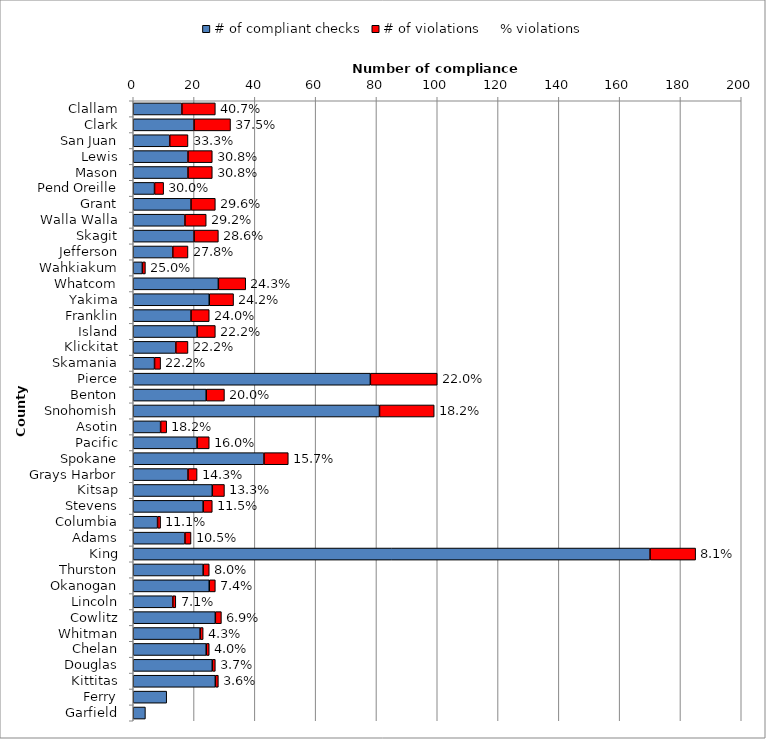
| Category | # of compliant checks | # of violations | % violations |
|---|---|---|---|
| Clallam | 16 | 11 | 0.407 |
| Clark | 20 | 12 | 0.375 |
| San Juan | 12 | 6 | 0.333 |
| Lewis | 18 | 8 | 0.308 |
| Mason | 18 | 8 | 0.308 |
| Pend Oreille | 7 | 3 | 0.3 |
| Grant | 19 | 8 | 0.296 |
| Walla Walla | 17 | 7 | 0.292 |
| Skagit | 20 | 8 | 0.286 |
| Jefferson | 13 | 5 | 0.278 |
| Wahkiakum | 3 | 1 | 0.25 |
| Whatcom | 28 | 9 | 0.243 |
| Yakima | 25 | 8 | 0.242 |
| Franklin | 19 | 6 | 0.24 |
| Island | 21 | 6 | 0.222 |
| Klickitat | 14 | 4 | 0.222 |
| Skamania | 7 | 2 | 0.222 |
| Pierce | 78 | 22 | 0.22 |
| Benton | 24 | 6 | 0.2 |
| Snohomish | 81 | 18 | 0.182 |
| Asotin | 9 | 2 | 0.182 |
| Pacific | 21 | 4 | 0.16 |
| Spokane | 43 | 8 | 0.157 |
| Grays Harbor | 18 | 3 | 0.143 |
| Kitsap | 26 | 4 | 0.133 |
| Stevens | 23 | 3 | 0.115 |
| Columbia | 8 | 1 | 0.111 |
| Adams | 17 | 2 | 0.105 |
| King | 170 | 15 | 0.081 |
| Thurston | 23 | 2 | 0.08 |
| Okanogan | 25 | 2 | 0.074 |
| Lincoln | 13 | 1 | 0.071 |
| Cowlitz | 27 | 2 | 0.069 |
| Whitman | 22 | 1 | 0.043 |
| Chelan | 24 | 1 | 0.04 |
| Douglas | 26 | 1 | 0.037 |
| Kittitas | 27 | 1 | 0.036 |
| Ferry | 11 | 0 | 0 |
| Garfield | 4 | 0 | 0 |